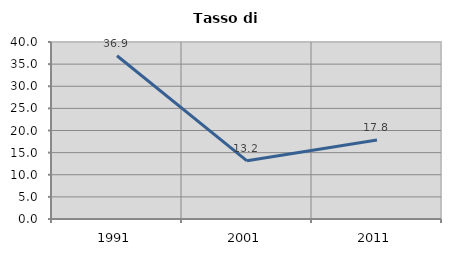
| Category | Tasso di disoccupazione   |
|---|---|
| 1991.0 | 36.9 |
| 2001.0 | 13.151 |
| 2011.0 | 17.836 |